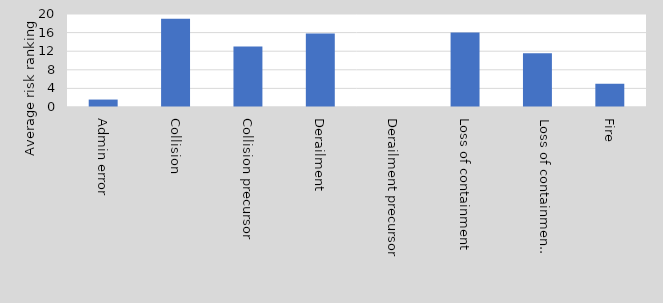
| Category | Series 0 |
|---|---|
| Admin error | 1.6 |
| Collision | 19 |
| Collision precursor | 13 |
| Derailment | 15.8 |
| Derailment precursor | 0 |
| Loss of containment | 16 |
| Loss of containment precursor | 11.571 |
| Fire | 5 |